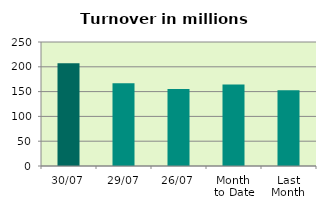
| Category | Series 0 |
|---|---|
| 30/07 | 207.198 |
| 29/07 | 167.041 |
| 26/07 | 155.304 |
| Month 
to Date | 164.251 |
| Last
Month | 152.535 |